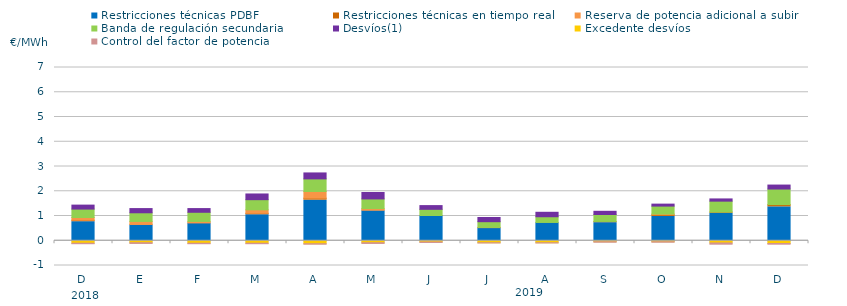
| Category | Restricciones técnicas PDBF | Restricciones técnicas en tiempo real | Reserva de potencia adicional a subir | Banda de regulación secundaria | Desvíos(1) | Excedente desvíos | Control del factor de potencia |
|---|---|---|---|---|---|---|---|
| D | 0.77 | 0.06 | 0.11 | 0.34 | 0.16 | -0.1 | -0.06 |
| E | 0.63 | 0.03 | 0.12 | 0.35 | 0.17 | -0.08 | -0.07 |
| F | 0.71 | 0.01 | 0.06 | 0.37 | 0.15 | -0.1 | -0.06 |
| M | 1.05 | 0.06 | 0.14 | 0.41 | 0.23 | -0.1 | -0.06 |
| A | 1.64 | 0.08 | 0.27 | 0.51 | 0.24 | -0.12 | -0.06 |
| M | 1.21 | 0.03 | 0.06 | 0.39 | 0.26 | -0.08 | -0.07 |
| J | 1.01 | 0.01 | 0 | 0.25 | 0.15 | -0.05 | -0.06 |
| J | 0.51 | 0.02 | 0.01 | 0.23 | 0.17 | -0.08 | -0.05 |
| A | 0.73 | 0.01 | 0 | 0.23 | 0.18 | -0.08 | -0.05 |
| S | 0.73 | 0.05 | 0 | 0.28 | 0.13 | -0.04 | -0.06 |
| O | 0.98 | 0.07 | 0.03 | 0.32 | 0.08 | -0.04 | -0.06 |
| N | 1.11 | 0.05 | 0 | 0.44 | 0.09 | -0.09 | -0.09 |
| D | 1.37 | 0.09 | 0 | 0.63 | 0.16 | -0.11 | -0.07 |